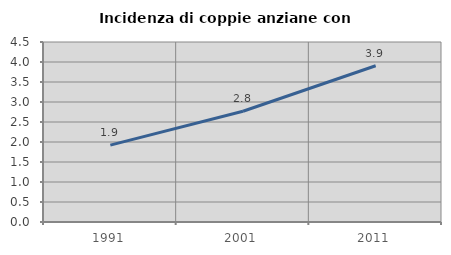
| Category | Incidenza di coppie anziane con figli |
|---|---|
| 1991.0 | 1.921 |
| 2001.0 | 2.769 |
| 2011.0 | 3.906 |